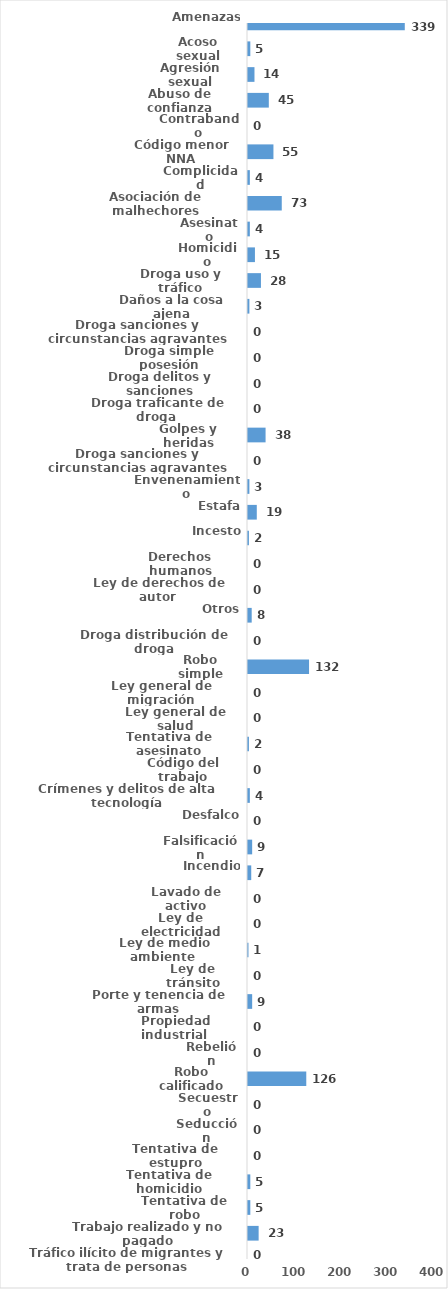
| Category | Series 0 |
|---|---|
| Amenazas | 339 |
| Acoso sexual | 5 |
| Agresión sexual | 14 |
| Abuso de confianza | 45 |
| Contrabando | 0 |
| Código menor NNA | 55 |
| Complicidad | 4 |
| Asociación de malhechores | 73 |
| Asesinato | 4 |
| Homicidio | 15 |
| Droga uso y tráfico | 28 |
| Daños a la cosa ajena | 3 |
| Droga sanciones y circunstancias agravantes | 0 |
| Droga simple posesión | 0 |
| Droga delitos y sanciones | 0 |
| Droga traficante de droga  | 0 |
| Golpes y heridas | 38 |
| Droga sanciones y circunstancias agravantes | 0 |
| Envenenamiento | 3 |
| Estafa | 19 |
| Incesto | 2 |
| Derechos humanos | 0 |
| Ley de derechos de autor  | 0 |
| Otros | 8 |
| Droga distribución de droga | 0 |
| Robo simple | 132 |
| Ley general de migración | 0 |
| Ley general de salud | 0 |
| Tentativa de asesinato | 2 |
| Código del trabajo | 0 |
| Crímenes y delitos de alta tecnología | 4 |
| Desfalco | 0 |
| Falsificación | 9 |
| Incendio | 7 |
| Lavado de activo | 0 |
| Ley de electricidad | 0 |
| Ley de medio ambiente  | 1 |
| Ley de tránsito | 0 |
| Porte y tenencia de armas | 9 |
| Propiedad industrial  | 0 |
| Rebelión | 0 |
| Robo calificado | 126 |
| Secuestro | 0 |
| Seducción | 0 |
| Tentativa de estupro | 0 |
| Tentativa de homicidio | 5 |
| Tentativa de robo | 5 |
| Trabajo realizado y no pagado | 23 |
| Tráfico ilícito de migrantes y trata de personas | 0 |